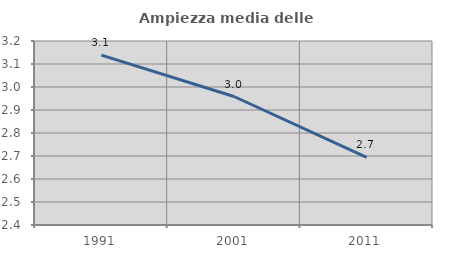
| Category | Ampiezza media delle famiglie |
|---|---|
| 1991.0 | 3.139 |
| 2001.0 | 2.959 |
| 2011.0 | 2.694 |